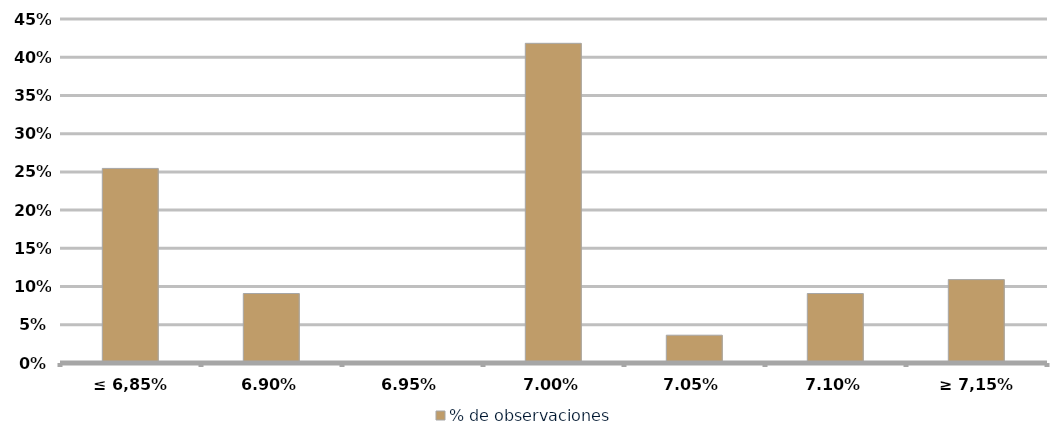
| Category | % de observaciones  |
|---|---|
| ≤ 6,85% | 0.255 |
| 6,90% | 0.091 |
| 6,95% | 0 |
| 7,00% | 0.418 |
| 7,05% | 0.036 |
| 7,10% | 0.091 |
| ≥ 7,15% | 0.109 |